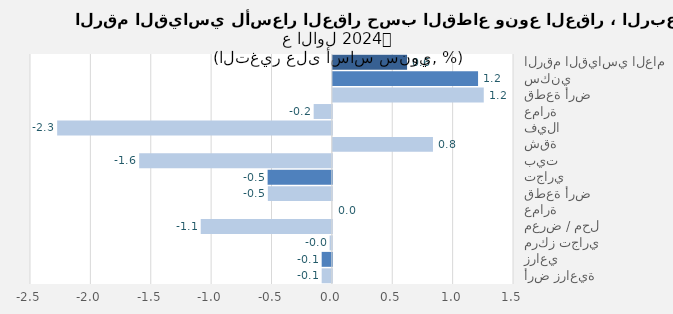
| Category | Series 0 |
|---|---|
| الرقم القياسي العام | 0.615 |
| سكني | 1.202 |
| قطعة أرض | 1.25 |
| عمارة | -0.151 |
| فيلا | -2.275 |
| شقة | 0.829 |
| بيت | -1.596 |
| تجاري | -0.532 |
| قطعة أرض | -0.53 |
| عمارة | 0 |
| معرض / محل | -1.086 |
| مركز تجاري | -0.019 |
| زراعي | -0.084 |
| أرض زراعية | -0.084 |